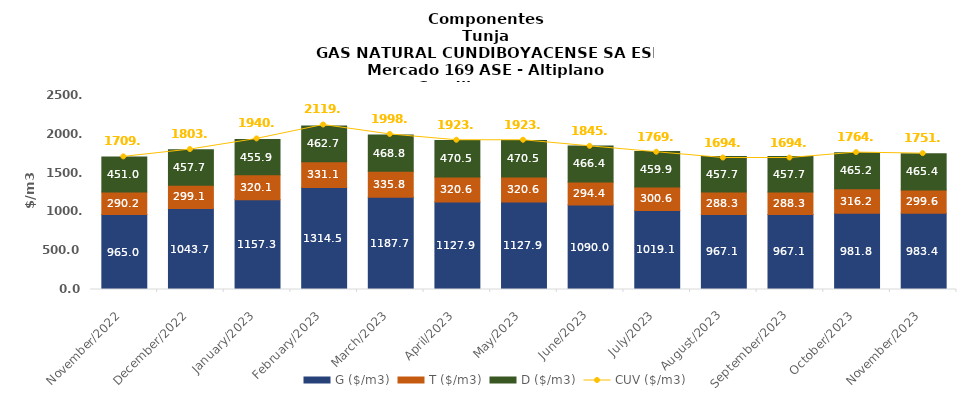
| Category | G ($/m3) | T ($/m3) | D ($/m3) |
|---|---|---|---|
| 2022-11-01 | 964.95 | 290.22 | 450.99 |
| 2022-12-01 | 1043.68 | 299.05 | 457.65 |
| 2023-01-01 | 1157.27 | 320.12 | 455.93 |
| 2023-02-01 | 1314.49 | 331.09 | 462.69 |
| 2023-03-01 | 1187.7 | 335.79 | 468.75 |
| 2023-04-01 | 1127.9 | 320.55 | 470.54 |
| 2023-05-01 | 1127.9 | 320.55 | 470.54 |
| 2023-06-01 | 1090.01 | 294.4 | 466.35 |
| 2023-07-01 | 1019.05 | 300.55 | 459.92 |
| 2023-08-01 | 967.08 | 288.3 | 457.73 |
| 2023-09-01 | 967.08 | 288.3 | 457.72 |
| 2023-10-01 | 981.83 | 316.2 | 465.18 |
| 2023-11-01 | 983.39 | 299.62 | 465.37 |